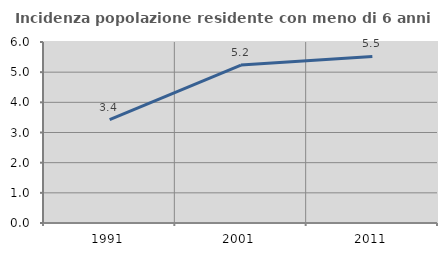
| Category | Incidenza popolazione residente con meno di 6 anni |
|---|---|
| 1991.0 | 3.425 |
| 2001.0 | 5.236 |
| 2011.0 | 5.522 |